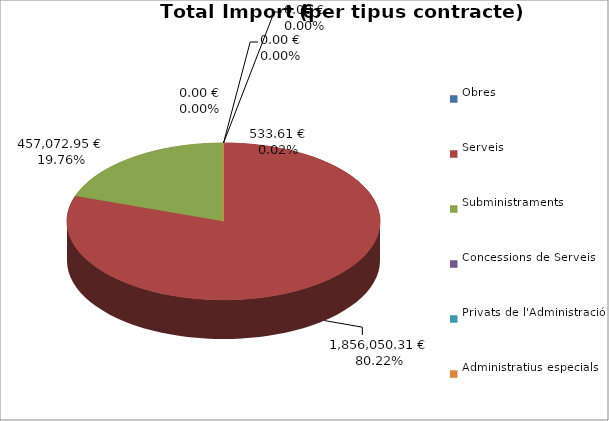
| Category | Total preu
(amb IVA) |
|---|---|
| Obres | 533.61 |
| Serveis | 1856050.31 |
| Subministraments | 457072.95 |
| Concessions de Serveis | 0 |
| Privats de l'Administració | 0 |
| Administratius especials | 0 |